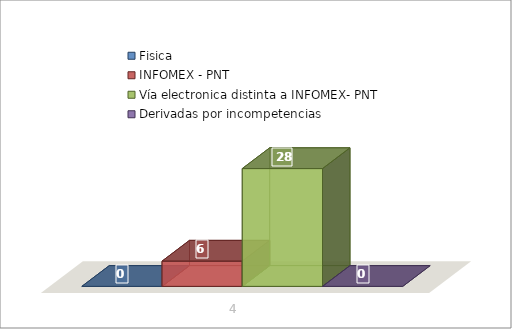
| Category | Fisica | INFOMEX - PNT | Vía electronica distinta a INFOMEX- PNT | Derivadas por incompetencias |
|---|---|---|---|---|
| 0 | 0 | 6 | 28 | 0 |